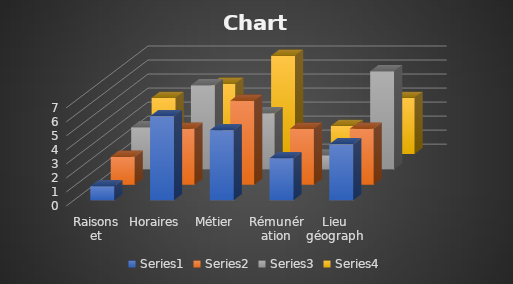
| Category | Series 0 | Series 1 | Series 2 | Series 3 |
|---|---|---|---|---|
| Raisons et classement | 1 | 2 | 3 | 4 |
| Horaires | 6 | 4 | 6 | 5 |
| Métier | 5 | 6 | 4 | 7 |
| Rémunération | 3 | 4 | 1 | 2 |
| Lieu géographique | 4 | 4 | 7 | 4 |